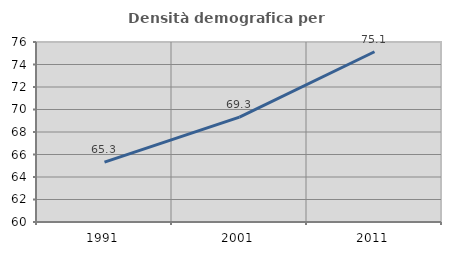
| Category | Densità demografica |
|---|---|
| 1991.0 | 65.326 |
| 2001.0 | 69.326 |
| 2011.0 | 75.133 |